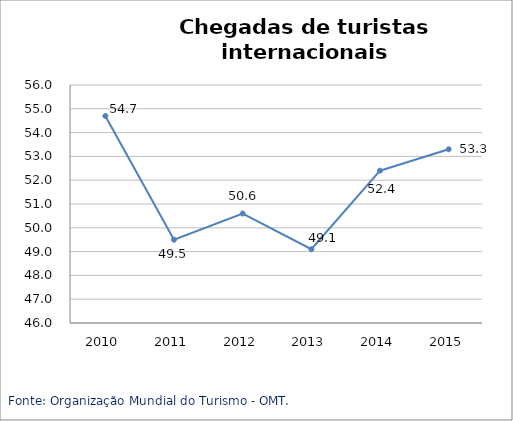
| Category | Oriente Médio |
|---|---|
| 2010.0 | 54.7 |
| 2011.0 | 49.5 |
| 2012.0 | 50.6 |
| 2013.0 | 49.1 |
| 2014.0 | 52.4 |
| 2015.0 | 53.3 |